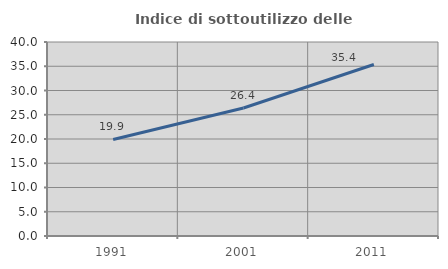
| Category | Indice di sottoutilizzo delle abitazioni  |
|---|---|
| 1991.0 | 19.905 |
| 2001.0 | 26.394 |
| 2011.0 | 35.366 |